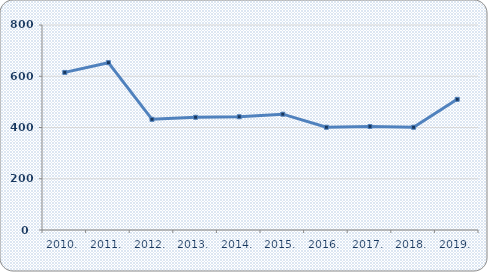
| Category | Broj zaposlenih |
|---|---|
| 2010. | 615 |
| 2011. | 653 |
| 2012. | 432 |
| 2013. | 440 |
| 2014. | 442 |
| 2015. | 452 |
| 2016. | 401 |
| 2017. | 404 |
| 2018. | 401 |
| 2019. | 510 |